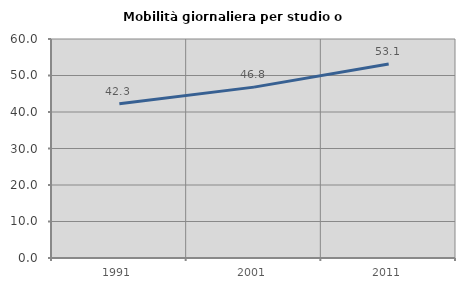
| Category | Mobilità giornaliera per studio o lavoro |
|---|---|
| 1991.0 | 42.261 |
| 2001.0 | 46.815 |
| 2011.0 | 53.147 |